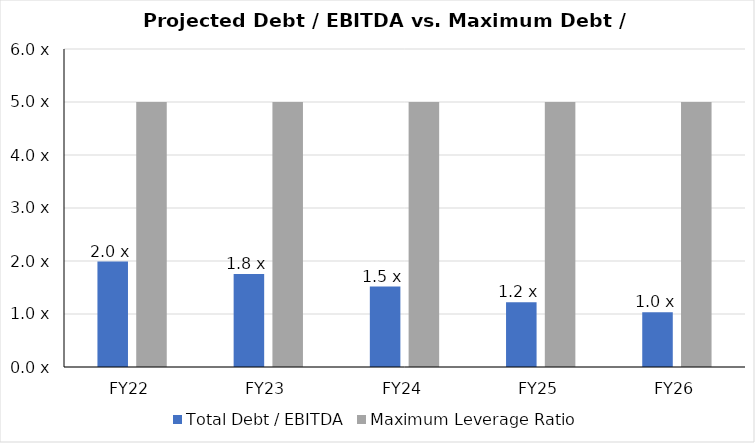
| Category | Total Debt / EBITDA | Maximum Leverage Ratio |
|---|---|---|
| 2022-12-31 | 1.99 | 5 |
| 2023-12-31 | 1.755 | 5 |
| 2024-12-31 | 1.517 | 5 |
| 2025-12-31 | 1.219 | 5 |
| 2026-12-31 | 1.031 | 5 |